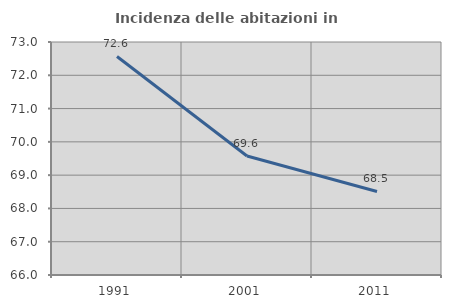
| Category | Incidenza delle abitazioni in proprietà  |
|---|---|
| 1991.0 | 72.564 |
| 2001.0 | 69.574 |
| 2011.0 | 68.509 |